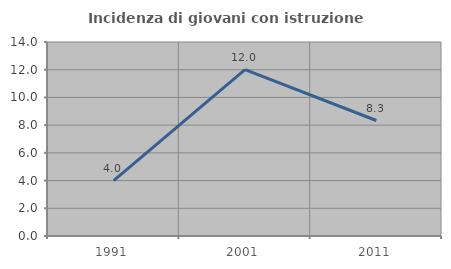
| Category | Incidenza di giovani con istruzione universitaria |
|---|---|
| 1991.0 | 4 |
| 2001.0 | 12 |
| 2011.0 | 8.333 |